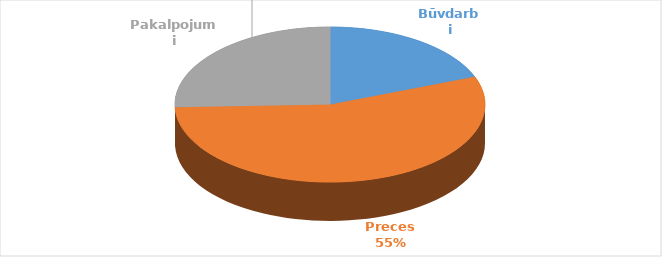
| Category | Noslēgto līgumu summa (EUR) | Īpatsvars, % |
|---|---|---|
| Būvdarbi | 124242227 | 0.192 |
| Preces | 358602200 | 0.553 |
| Pakalpojumi | 165781801 | 0.256 |